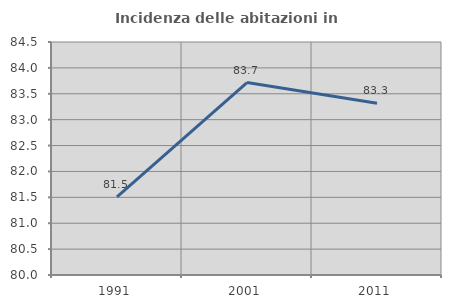
| Category | Incidenza delle abitazioni in proprietà  |
|---|---|
| 1991.0 | 81.51 |
| 2001.0 | 83.716 |
| 2011.0 | 83.317 |